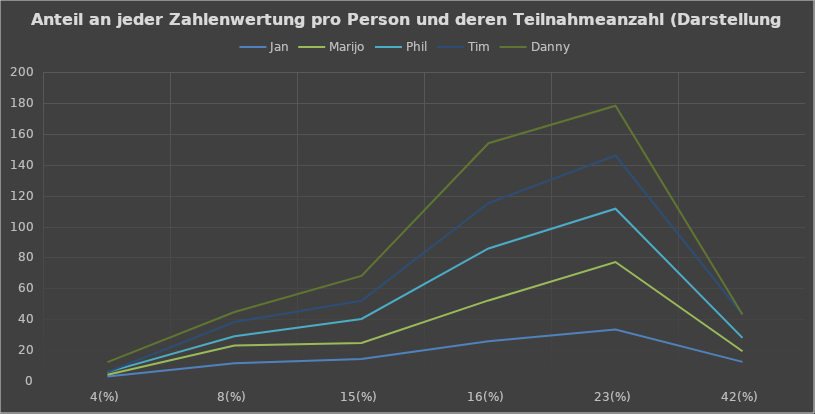
| Category | Jan | Marijo | Phil | Tim | Danny |
|---|---|---|---|---|---|
| 4(%) | 2.857 | 1.149 | 1.724 | 0 | 6.452 |
| 8(%) | 11.429 | 11.494 | 6.034 | 9.244 | 6.452 |
| 15(%) | 14.286 | 10.345 | 15.517 | 11.765 | 16.129 |
| 16(%) | 25.714 | 26.437 | 33.621 | 29.412 | 38.71 |
| 23(%) | 33.333 | 43.678 | 34.483 | 34.454 | 32.258 |
| 42(%) | 12.381 | 6.897 | 8.621 | 15.126 | 0 |